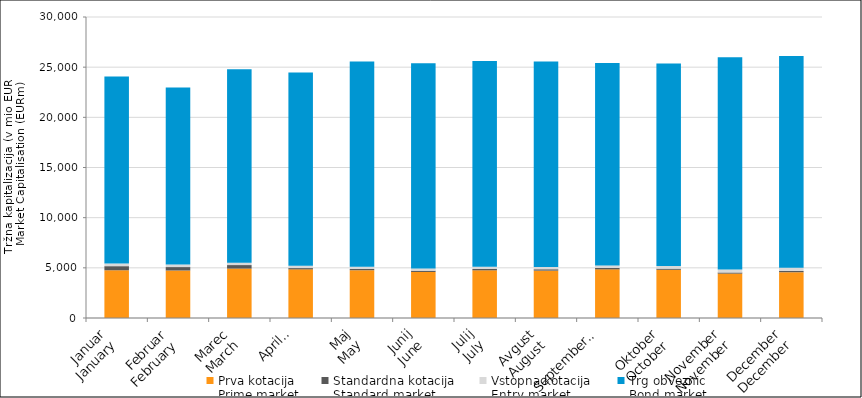
| Category | Prva kotacija
Prime market | Standardna kotacija
Standard market | Vstopna kotacija
Entry market | Trg obveznic
Bond market |
|---|---|---|---|---|
| Januar
January | 4758.479 | 408.553 | 259.326 | 18647.754 |
| Februar
February | 4734.129 | 342.65 | 256.207 | 17636.689 |
| Marec
March | 4925.13 | 351.237 | 241.636 | 19269.856 |
| April
April | 4847.533 | 128.231 | 226.395 | 19266.249 |
| Maj
May | 4760.61 | 126.366 | 230.281 | 20438.743 |
| Junij
June | 4587.454 | 127.916 | 227.63 | 20440.45 |
| Julij
July | 4752.079 | 132.776 | 220.707 | 20510.666 |
| Avgust
August | 4718.969 | 141.075 | 223.954 | 20491.303 |
| September
September | 4847.165 | 144.382 | 249.012 | 20175.492 |
| Oktober
October | 4804.102 | 111.471 | 275.867 | 20165.666 |
| November
November | 4425.07 | 113.131 | 301.77 | 21159.098 |
| December
December | 4563.063 | 118.82 | 317.962 | 21117.228 |